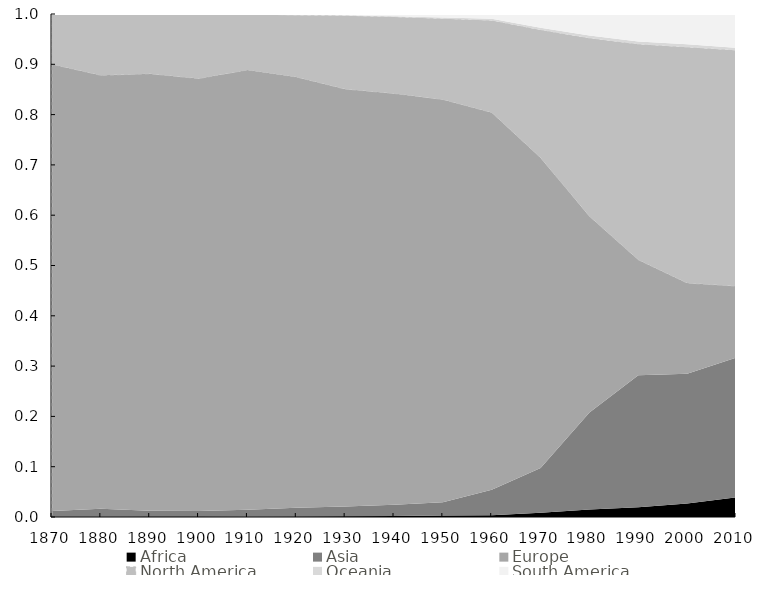
| Category | Africa | Asia | Europe | North America | Oceania | South America |
|---|---|---|---|---|---|---|
| 1870 | 0 | 0.012 | 0.888 | 0.098 | 0.001 | 0.001 |
| 1880 | 0 | 0.016 | 0.862 | 0.12 | 0.001 | 0.001 |
| 1890 | 0 | 0.012 | 0.869 | 0.117 | 0.001 | 0.001 |
| 1900 | 0 | 0.012 | 0.86 | 0.127 | 0.001 | 0 |
| 1910 | 0 | 0.014 | 0.874 | 0.11 | 0.001 | 0.001 |
| 1920 | 0.001 | 0.017 | 0.857 | 0.123 | 0.001 | 0.001 |
| 1930 | 0.001 | 0.019 | 0.83 | 0.146 | 0.001 | 0.002 |
| 1940 | 0.002 | 0.022 | 0.818 | 0.152 | 0.002 | 0.004 |
| 1950 | 0.003 | 0.027 | 0.801 | 0.16 | 0.003 | 0.007 |
| 1960 | 0.004 | 0.051 | 0.75 | 0.183 | 0.004 | 0.009 |
| 1970 | 0.009 | 0.089 | 0.617 | 0.254 | 0.004 | 0.027 |
| 1980 | 0.015 | 0.193 | 0.39 | 0.354 | 0.006 | 0.043 |
| 1990 | 0.019 | 0.263 | 0.229 | 0.429 | 0.005 | 0.055 |
| 2000 | 0.027 | 0.258 | 0.18 | 0.469 | 0.006 | 0.06 |
| 2010 | 0.039 | 0.278 | 0.142 | 0.469 | 0.005 | 0.067 |